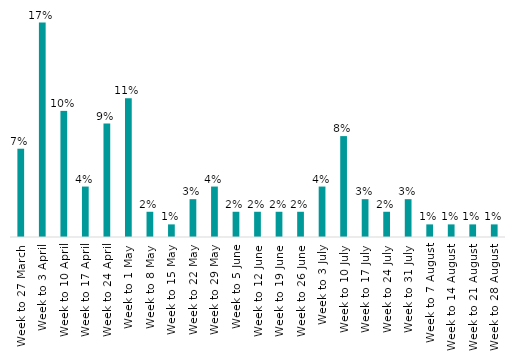
| Category | Series 0 |
|---|---|
| Week to 27 March | 0.07 |
| Week to 3 April | 0.17 |
| Week to 10 April | 0.1 |
| Week to 17 April | 0.04 |
| Week to 24 April | 0.09 |
| Week to 1 May | 0.11 |
| Week to 8 May | 0.02 |
| Week to 15 May | 0.01 |
| Week to 22 May | 0.03 |
| Week to 29 May | 0.04 |
| Week to 5 June | 0.02 |
| Week to 12 June | 0.02 |
| Week to 19 June | 0.02 |
| Week to 26 June | 0.02 |
| Week to 3 July | 0.04 |
| Week to 10 July | 0.08 |
| Week to 17 July | 0.03 |
| Week to 24 July | 0.02 |
| Week to 31 July | 0.03 |
| Week to 7 August | 0.01 |
| Week to 14 August | 0.01 |
| Week to 21 August | 0.01 |
| Week to 28 August | 0.01 |